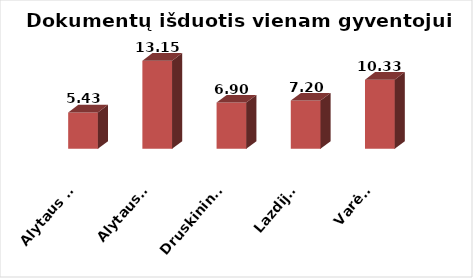
| Category | Series 0 |
|---|---|
| Alytaus m. | 5.434 |
| Alytaus r. | 13.148 |
| Druskininkai | 6.905 |
| Lazdijai | 7.202 |
| Varėna | 10.331 |